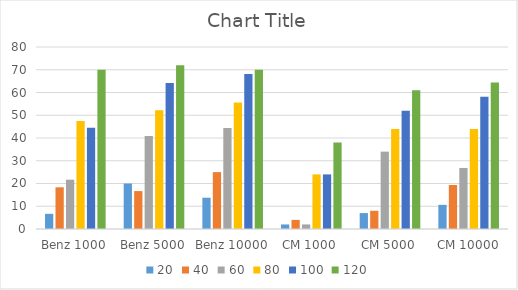
| Category | 20 | 40 | 60 | 80 | 100 | 120 |
|---|---|---|---|---|---|---|
| Benz 1000 | 6.667 | 18.333 | 21.667 | 47.5 | 44.5 | 70 |
| Benz 5000 | 20 | 16.667 | 40.833 | 52.167 | 64.167 | 72 |
| Benz 10000 | 13.75 | 25 | 44.375 | 55.625 | 68.125 | 70 |
| CM 1000 | 2 | 4 | 2 | 24 | 24 | 38 |
| CM 5000 | 7 | 8 | 34 | 44 | 52 | 61 |
| CM 10000 | 10.625 | 19.333 | 26.833 | 44 | 58.083 | 64.417 |